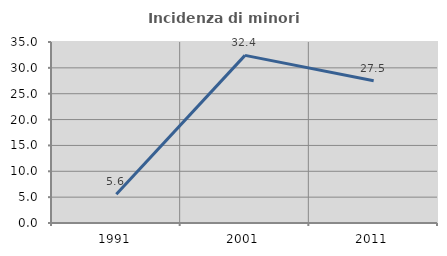
| Category | Incidenza di minori stranieri |
|---|---|
| 1991.0 | 5.556 |
| 2001.0 | 32.414 |
| 2011.0 | 27.51 |